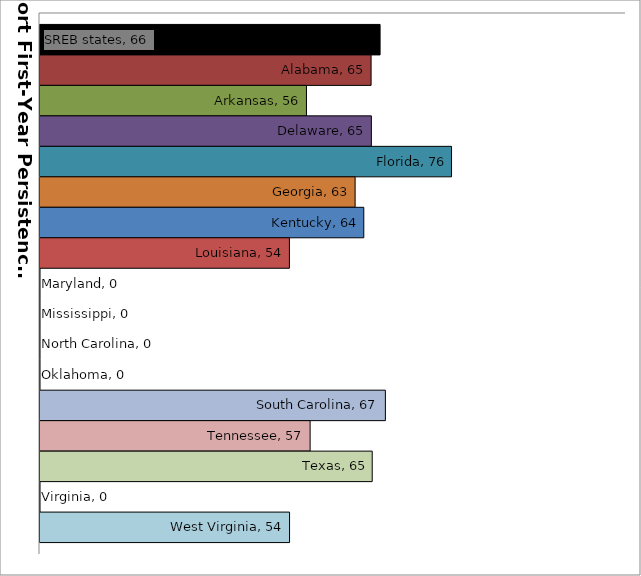
| Category | SREB states | Alabama | Arkansas | Delaware | Florida | Georgia | Kentucky | Louisiana | Maryland | Mississippi | North Carolina | Oklahoma | South Carolina | Tennessee | Texas | Virginia | West Virginia |
|---|---|---|---|---|---|---|---|---|---|---|---|---|---|---|---|---|---|
| 0 | 66.428 | 65.2 | 56.377 | 65.237 | 76.183 | 63.019 | 64.204 | 54.049 | 0 | 0 | 0 | 0 | 67.15 | 56.877 | 65.352 | 0 | 54.069 |